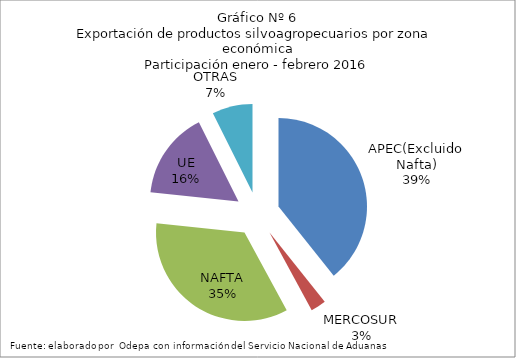
| Category | Series 0 |
|---|---|
| APEC(Excluido Nafta) | 995828.859 |
| MERCOSUR | 71396.061 |
| NAFTA | 876782.895 |
| UE | 404467.213 |
| OTRAS | 187305.972 |